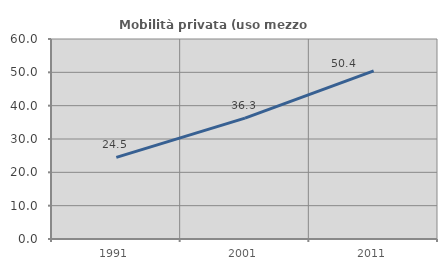
| Category | Mobilità privata (uso mezzo privato) |
|---|---|
| 1991.0 | 24.468 |
| 2001.0 | 36.253 |
| 2011.0 | 50.435 |